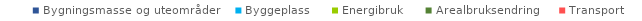
| Category | Bygningsmasse og uteområder | Byggeplass | Energibruk | Arealbruksendring | Transport |
|---|---|---|---|---|---|
| Hovedscenario | 0 | 0 | 0 | 0 |  |
| Scenario med tiltak | 0 | 0 | 0 | 0 |  |